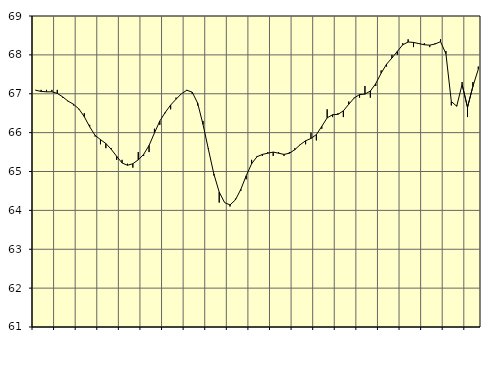
| Category | Piggar | Series 1 |
|---|---|---|
| nan | 67.1 | 67.09 |
| 1.0 | 67.1 | 67.06 |
| 1.0 | 67.1 | 67.05 |
| 1.0 | 67.1 | 67.05 |
| nan | 67.1 | 67.01 |
| 2.0 | 66.9 | 66.92 |
| 2.0 | 66.8 | 66.81 |
| 2.0 | 66.7 | 66.73 |
| nan | 66.6 | 66.61 |
| 3.0 | 66.5 | 66.41 |
| 3.0 | 66.2 | 66.15 |
| 3.0 | 65.9 | 65.93 |
| nan | 65.7 | 65.82 |
| 4.0 | 65.6 | 65.72 |
| 4.0 | 65.6 | 65.57 |
| 4.0 | 65.3 | 65.39 |
| nan | 65.3 | 65.22 |
| 5.0 | 65.2 | 65.16 |
| 5.0 | 65.1 | 65.2 |
| 5.0 | 65.5 | 65.3 |
| nan | 65.4 | 65.44 |
| 6.0 | 65.5 | 65.67 |
| 6.0 | 66.1 | 65.99 |
| 6.0 | 66.2 | 66.3 |
| nan | 66.5 | 66.52 |
| 7.0 | 66.6 | 66.71 |
| 7.0 | 66.9 | 66.86 |
| 7.0 | 67 | 67 |
| nan | 67.1 | 67.09 |
| 8.0 | 67 | 67.04 |
| 8.0 | 66.7 | 66.76 |
| 8.0 | 66.3 | 66.21 |
| nan | 65.6 | 65.57 |
| 9.0 | 64.9 | 64.94 |
| 9.0 | 64.2 | 64.47 |
| 9.0 | 64.2 | 64.2 |
| nan | 64.1 | 64.14 |
| 10.0 | 64.3 | 64.27 |
| 10.0 | 64.5 | 64.54 |
| 10.0 | 64.8 | 64.89 |
| nan | 65.3 | 65.2 |
| 11.0 | 65.4 | 65.38 |
| 11.0 | 65.4 | 65.44 |
| 11.0 | 65.5 | 65.47 |
| nan | 65.4 | 65.5 |
| 12.0 | 65.5 | 65.47 |
| 12.0 | 65.4 | 65.44 |
| 12.0 | 65.5 | 65.47 |
| nan | 65.6 | 65.56 |
| 13.0 | 65.7 | 65.69 |
| 13.0 | 65.7 | 65.79 |
| 13.0 | 66 | 65.85 |
| nan | 65.8 | 65.95 |
| 14.0 | 66.1 | 66.16 |
| 14.0 | 66.6 | 66.38 |
| 14.0 | 66.4 | 66.46 |
| nan | 66.5 | 66.47 |
| 15.0 | 66.4 | 66.56 |
| 15.0 | 66.8 | 66.73 |
| 15.0 | 66.9 | 66.89 |
| nan | 66.9 | 66.98 |
| 16.0 | 67.2 | 66.99 |
| 16.0 | 66.9 | 67.07 |
| 16.0 | 67.2 | 67.26 |
| nan | 67.6 | 67.53 |
| 17.0 | 67.7 | 67.76 |
| 17.0 | 68 | 67.92 |
| 17.0 | 68 | 68.09 |
| nan | 68.3 | 68.26 |
| 18.0 | 68.4 | 68.33 |
| 18.0 | 68.2 | 68.32 |
| 18.0 | 68.3 | 68.29 |
| nan | 68.3 | 68.26 |
| 19.0 | 68.2 | 68.25 |
| 19.0 | 68.3 | 68.28 |
| 19.0 | 68.4 | 68.34 |
| nan | 68.1 | 68.03 |
| 20.0 | 66.7 | 66.8 |
| 20.0 | 66.7 | 66.68 |
| 20.0 | 67.3 | 67.24 |
| nan | 66.4 | 66.65 |
| 21.0 | 67.3 | 67.19 |
| 21.0 | 67.7 | 67.63 |